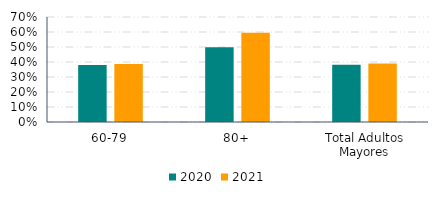
| Category | 2020 | 2021 |
|---|---|---|
| 60-79 | 0.38 | 0.386 |
| 80+ | 0.499 | 0.594 |
| Total Adultos Mayores | 0.382 | 0.39 |